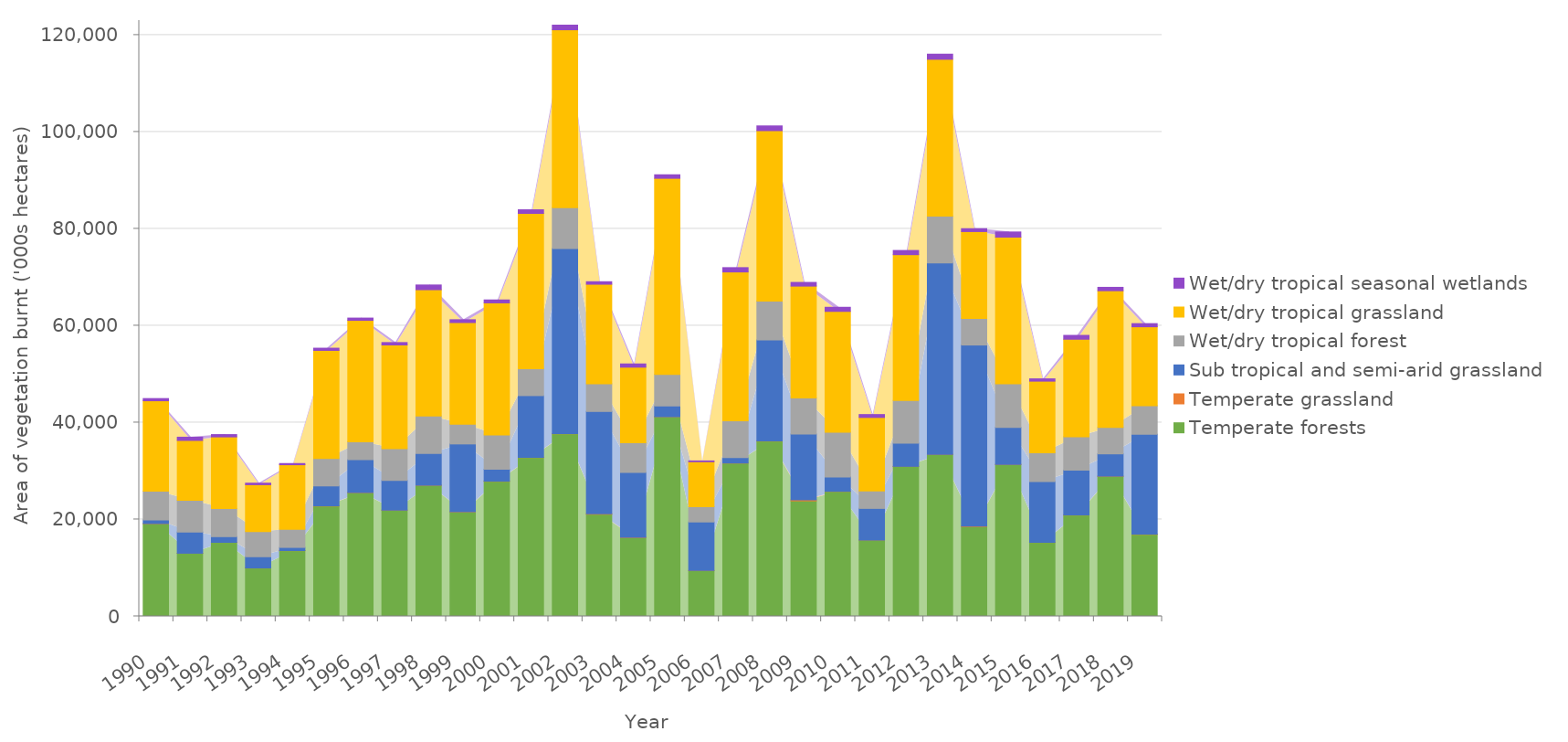
| Category | Temperate forests | Temperate grassland | Sub tropical and semi-arid grassland | Wet/dry tropical forest | Wet/dry tropical grassland | Wet/dry tropical seasonal wetlands |
|---|---|---|---|---|---|---|
| 1990.0 | 19128811.843 | 29995 | 765786.773 | 5910159.562 | 18674320.058 | 454491.785 |
| 1991.0 | 13025081.815 | 5301 | 4375070.58 | 6558248.29 | 12352904.125 | 672177.689 |
| 1992.0 | 15271312.872 | 9641 | 1172552.058 | 5801255.088 | 14793968.581 | 477344.291 |
| 1993.0 | 9980452.657 | 15843 | 2311638.114 | 5209439.5 | 9667210.627 | 313242.03 |
| 1994.0 | 13562043.539 | 25474 | 640835.458 | 3759933.15 | 13310023.964 | 252019.575 |
| 1995.0 | 22774505.859 | 45636 | 4105793.479 | 5663043.214 | 22315164.228 | 459341.631 |
| 1996.0 | 25534743.839 | 26226.277 | 6789345.944 | 3695851.158 | 25062111.92 | 472631.919 |
| 1997.0 | 21910751.4 | 17716 | 6119994.017 | 6566036.456 | 21415863.358 | 494888.042 |
| 1998.0 | 27057913.026 | 12982.4 | 6564584.316 | 7719047.827 | 26080506.551 | 977406.474 |
| 1999.0 | 21557532.194 | 20407.1 | 14015354.894 | 4092701.199 | 20967378.013 | 590154.181 |
| 2000.0 | 27880310.705 | 26078 | 2468145.95 | 7069272.404 | 27272073.374 | 608237.331 |
| 2001.0 | 32794888.128 | 44623 | 12732143.062 | 5571583.363 | 32043286.702 | 751601.426 |
| 2002.0 | 37697880.732 | 23495 | 38192189.283 | 8444436.117 | 36741518.515 | 956362.217 |
| 2003.0 | 21079513.019 | 109361.99 | 21107711.052 | 5708381.844 | 20558765.296 | 520747.723 |
| 2004.0 | 16260350.493 | 43676.88 | 13396717.813 | 6153009.19 | 15586626.502 | 673723.991 |
| 2005.0 | 41213430.969 | 6146.8 | 2199274.148 | 6529584.769 | 40484926.813 | 728504.156 |
| 2006.0 | 9453602.983 | 22792.68 | 10010135.902 | 3149977.176 | 9280919.004 | 172683.979 |
| 2007.0 | 31633931.28 | 19880.09 | 1114483.095 | 7592178.606 | 30738328.886 | 895602.394 |
| 2008.0 | 36187699.097 | 15543.95 | 20870734.976 | 7990184.72 | 35207471.292 | 980227.805 |
| 2009.0 | 23839932.605 | 236191.45 | 13563050.293 | 7462833.368 | 23073137.268 | 766795.337 |
| 2010.0 | 25796539.928 | 17427.756 | 2976166.608 | 9221432.701 | 24946965.699 | 849574.228 |
| 2011.0 | 15766540.934 | 6879.08 | 6513297.753 | 3611168.448 | 15166295.928 | 600245.005 |
| 2012.0 | 30959821.929 | 6414.712 | 4771619.743 | 8837500.374 | 30092962.915 | 866859.014 |
| 2013.0 | 33423370.593 | 35888.17 | 39509671.396 | 9673352.725 | 32362318.787 | 1061051.805 |
| 2014.0 | 18528723.515 | 83338.834 | 37401788.015 | 5494632.975 | 17926266.447 | 602457.068 |
| 2015.0 | 31341232.356 | 29855.328 | 7640022.037 | 9004718.248 | 30277793.773 | 1063438.584 |
| 2016.0 | 15264955.434 | 29855.328 | 12535708.494 | 5939746.479 | 14786790.703 | 478164.73 |
| 2017.0 | 20915759.632 | 29855.328 | 9229458.404 | 6917478.239 | 20115618.796 | 800140.836 |
| 2018.0 | 28913273.943 | 29855.328 | 4602562.797 | 5466052.44 | 28210921.42 | 702352.524 |
| 2019.0 | 16930116.252 | 29855.328 | 20633641.721 | 5910308.466 | 16276555.377 | 653560.875 |